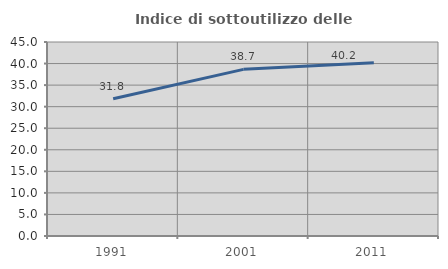
| Category | Indice di sottoutilizzo delle abitazioni  |
|---|---|
| 1991.0 | 31.829 |
| 2001.0 | 38.653 |
| 2011.0 | 40.171 |